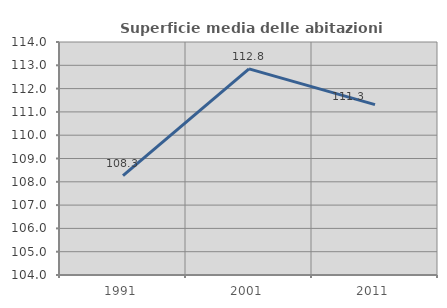
| Category | Superficie media delle abitazioni occupate |
|---|---|
| 1991.0 | 108.261 |
| 2001.0 | 112.847 |
| 2011.0 | 111.312 |